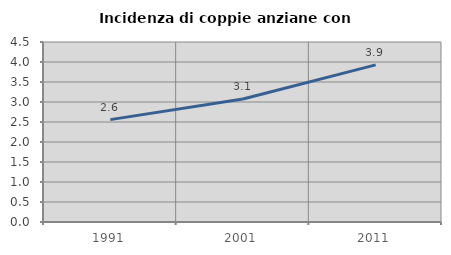
| Category | Incidenza di coppie anziane con figli |
|---|---|
| 1991.0 | 2.559 |
| 2001.0 | 3.077 |
| 2011.0 | 3.928 |